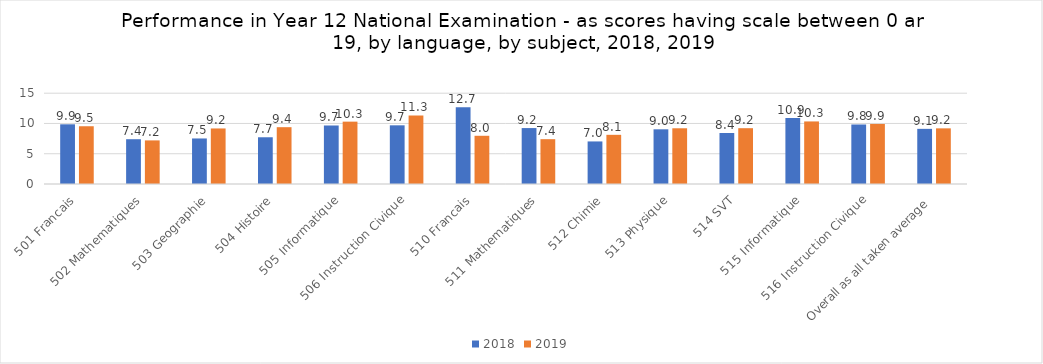
| Category | 2018 | 2019 |
|---|---|---|
| 501 Francais | 9.861 | 9.542 |
| 502 Mathematiques | 7.399 | 7.203 |
| 503 Geographie | 7.524 | 9.177 |
| 504 Histoire | 7.722 | 9.387 |
| 505 Informatique | 9.667 | 10.303 |
| 506 Instruction Civique | 9.696 | 11.332 |
| 510 Francais | 12.695 | 7.966 |
| 511 Mathematiques | 9.241 | 7.405 |
| 512 Chimie | 7.032 | 8.125 |
| 513 Physique | 9.036 | 9.207 |
| 514 SVT | 8.427 | 9.22 |
| 515 Informatique | 10.918 | 10.336 |
| 516 Instruction Civique | 9.832 | 9.922 |
| Overall as all taken average | 9.111 | 9.194 |